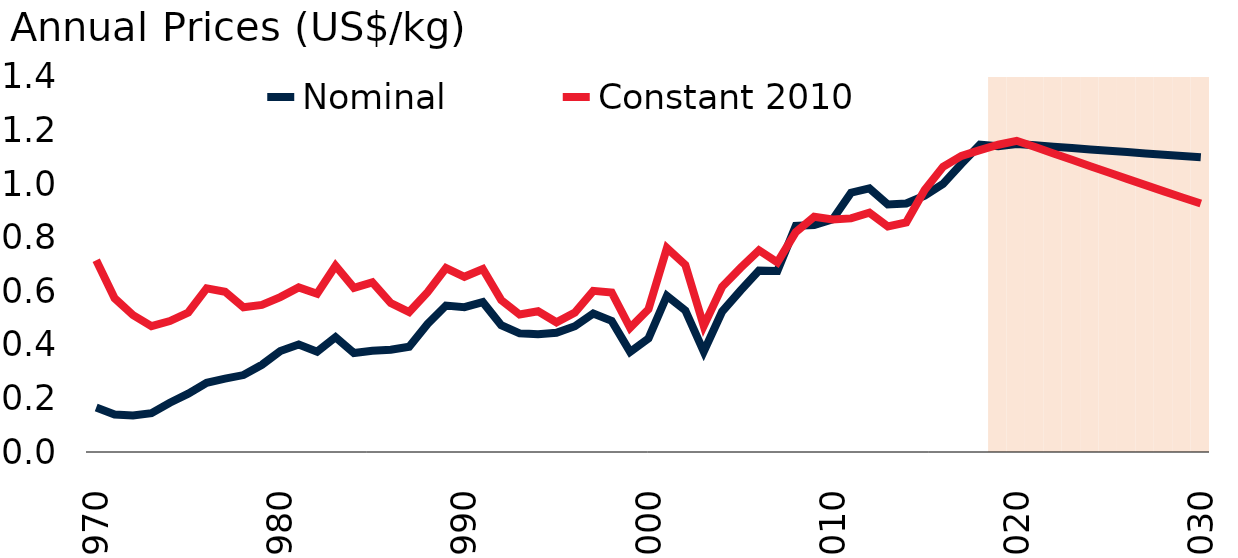
| Category | Series 2 |
|---|---|
| 1970.0 | 0 |
| 1971.0 | 0 |
| 1972.0 | 0 |
| 1973.0 | 0 |
| 1974.0 | 0 |
| 1975.0 | 0 |
| 1976.0 | 0 |
| 1977.0 | 0 |
| 1978.0 | 0 |
| 1979.0 | 0 |
| 1980.0 | 0 |
| 1981.0 | 0 |
| 1982.0 | 0 |
| 1983.0 | 0 |
| 1984.0 | 0 |
| 1985.0 | 0 |
| 1986.0 | 0 |
| 1987.0 | 0 |
| 1988.0 | 0 |
| 1989.0 | 0 |
| 1990.0 | 0 |
| 1991.0 | 0 |
| 1992.0 | 0 |
| 1993.0 | 0 |
| 1994.0 | 0 |
| 1995.0 | 0 |
| 1996.0 | 0 |
| 1997.0 | 0 |
| 1998.0 | 0 |
| 1999.0 | 0 |
| 2000.0 | 0 |
| 2001.0 | 0 |
| 2002.0 | 0 |
| 2003.0 | 0 |
| 2004.0 | 0 |
| 2005.0 | 0 |
| 2006.0 | 0 |
| 2007.0 | 0 |
| 2008.0 | 0 |
| 2009.0 | 0 |
| 2010.0 | 0 |
| 2011.0 | 0 |
| 2012.0 | 0 |
| 2013.0 | 0 |
| 2014.0 | 0 |
| 2015.0 | 0 |
| 2016.0 | 0 |
| 2017.0 | 0 |
| 2018.0 | 0 |
| 2019.0 | 1.4 |
| 2020.0 | 1.4 |
| 2021.0 | 1.4 |
| 2022.0 | 1.4 |
| 2023.0 | 1.4 |
| 2024.0 | 1.4 |
| 2025.0 | 1.4 |
| 2026.0 | 1.4 |
| 2027.0 | 1.4 |
| 2028.0 | 1.4 |
| 2029.0 | 1.4 |
| 2030.0 | 1.4 |